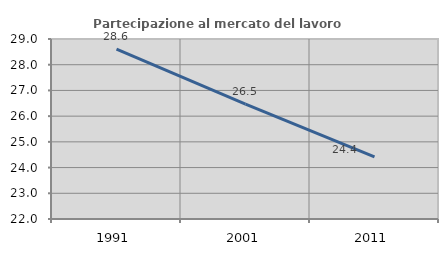
| Category | Partecipazione al mercato del lavoro  femminile |
|---|---|
| 1991.0 | 28.604 |
| 2001.0 | 26.464 |
| 2011.0 | 24.419 |